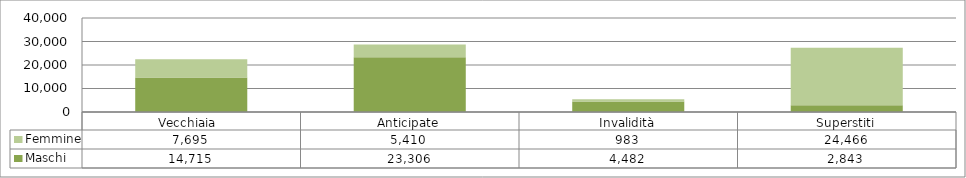
| Category | Maschi | Femmine |
|---|---|---|
| Vecchiaia  | 14715 | 7695 |
| Anticipate | 23306 | 5410 |
| Invalidità | 4482 | 983 |
| Superstiti | 2843 | 24466 |